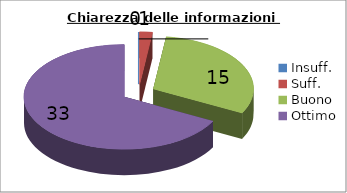
| Category | Chiarezza delle informazioni fornite |
|---|---|
| Insuff. | 0 |
| Suff. | 1 |
| Buono | 15 |
| Ottimo | 33 |